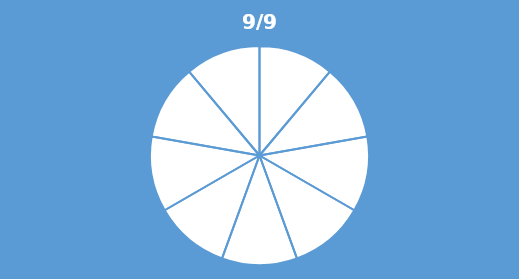
| Category | Series 0 |
|---|---|
| 0 | 0.111 |
| 1 | 0.111 |
| 2 | 0.111 |
| 3 | 0.111 |
| 4 | 0.111 |
| 5 | 0.111 |
| 6 | 0.111 |
| 7 | 0.111 |
| 8 | 0.111 |